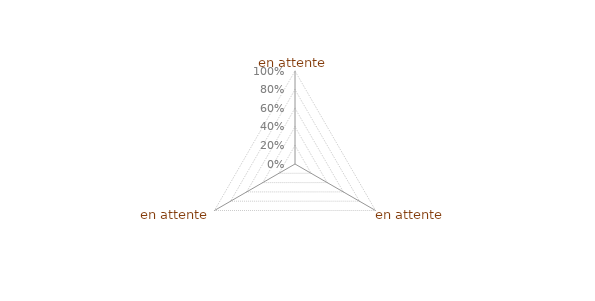
| Category | Article 5 |
|---|---|
| 0 | 0 |
| 1 | 0 |
| 2 | 0 |